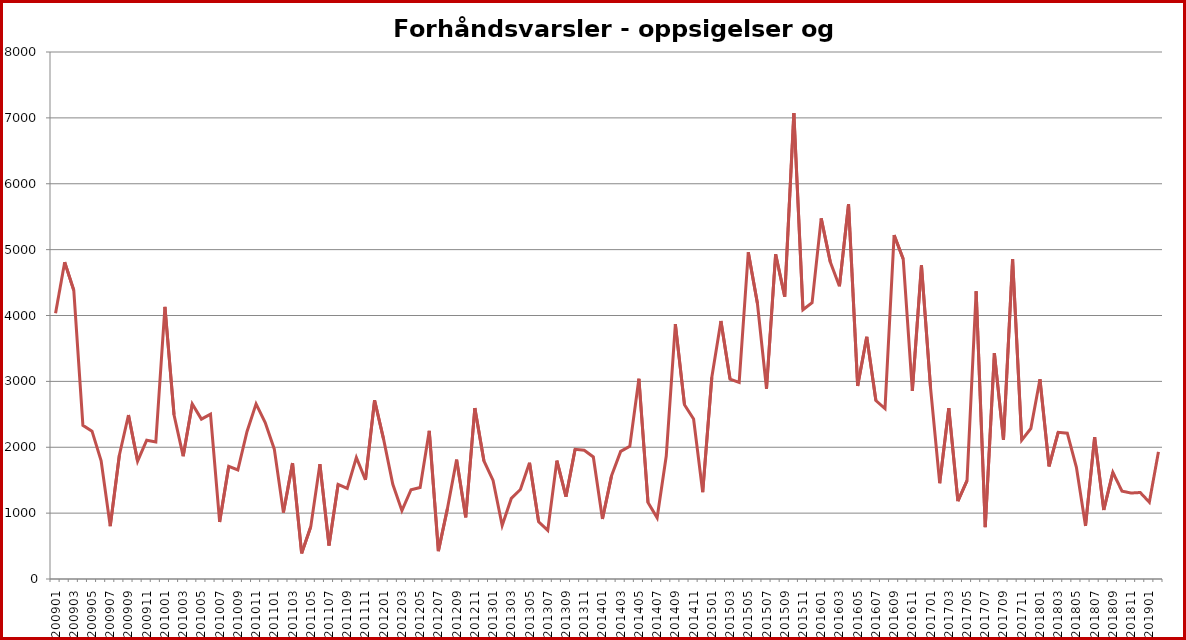
| Category | Series 1 |
|---|---|
| 200901.0 | 4035 |
| 200902.0 | 4810 |
| 200903.0 | 4381 |
| 200904.0 | 2332 |
| 200905.0 | 2245 |
| 200906.0 | 1794 |
| 200907.0 | 802 |
| 200908.0 | 1879 |
| 200909.0 | 2489 |
| 200910.0 | 1789 |
| 200911.0 | 2107 |
| 200912.0 | 2080 |
| 201001.0 | 4130 |
| 201002.0 | 2490 |
| 201003.0 | 1865 |
| 201004.0 | 2658 |
| 201005.0 | 2427 |
| 201006.0 | 2503 |
| 201007.0 | 866 |
| 201008.0 | 1711 |
| 201009.0 | 1655 |
| 201010.0 | 2235 |
| 201011.0 | 2658 |
| 201012.0 | 2374 |
| 201101.0 | 1971 |
| 201102.0 | 1008 |
| 201103.0 | 1759 |
| 201104.0 | 389 |
| 201105.0 | 794 |
| 201106.0 | 1744 |
| 201107.0 | 509 |
| 201108.0 | 1436 |
| 201109.0 | 1374 |
| 201110.0 | 1844 |
| 201111.0 | 1504 |
| 201112.0 | 2714 |
| 201201.0 | 2115 |
| 201202.0 | 1437 |
| 201203.0 | 1037 |
| 201204.0 | 1355 |
| 201205.0 | 1390 |
| 201206.0 | 2249 |
| 201207.0 | 423 |
| 201208.0 | 1073 |
| 201209.0 | 1812 |
| 201210.0 | 937 |
| 201211.0 | 2594 |
| 201212.0 | 1792 |
| 201301.0 | 1496 |
| 201302.0 | 813 |
| 201303.0 | 1223 |
| 201304.0 | 1358 |
| 201305.0 | 1765 |
| 201306.0 | 869 |
| 201307.0 | 738 |
| 201308.0 | 1797 |
| 201309.0 | 1250 |
| 201310.0 | 1969 |
| 201311.0 | 1954 |
| 201312.0 | 1853 |
| 201401.0 | 910 |
| 201402.0 | 1568 |
| 201403.0 | 1937 |
| 201404.0 | 2014 |
| 201405.0 | 3040 |
| 201406.0 | 1160 |
| 201407.0 | 929 |
| 201408.0 | 1866 |
| 201409.0 | 3868 |
| 201410.0 | 2646 |
| 201411.0 | 2429 |
| 201412.0 | 1317 |
| 201501.0 | 3062 |
| 201502.0 | 3915 |
| 201503.0 | 3035 |
| 201504.0 | 2985 |
| 201505.0 | 4960 |
| 201506.0 | 4185 |
| 201507.0 | 2888 |
| 201508.0 | 4930 |
| 201509.0 | 4286 |
| 201510.0 | 7072 |
| 201511.0 | 4087 |
| 201512.0 | 4193 |
| 201601.0 | 5475 |
| 201602.0 | 4812 |
| 201603.0 | 4444 |
| 201604.0 | 5691 |
| 201605.0 | 2931 |
| 201606.0 | 3676 |
| 201607.0 | 2709 |
| 201608.0 | 2588 |
| 201609.0 | 5220 |
| 201610.0 | 4857 |
| 201611.0 | 2855 |
| 201612.0 | 4761 |
| 201701.0 | 2898 |
| 201702.0 | 1454 |
| 201703.0 | 2594 |
| 201704.0 | 1182 |
| 201705.0 | 1494 |
| 201706.0 | 4368 |
| 201707.0 | 787 |
| 201708.0 | 3429 |
| 201709.0 | 2112 |
| 201710.0 | 4854 |
| 201711.0 | 2109 |
| 201712.0 | 2284 |
| 201801.0 | 3032 |
| 201802.0 | 1711 |
| 201803.0 | 2227 |
| 201804.0 | 2213 |
| 201805.0 | 1696 |
| 201806.0 | 805 |
| 201807.0 | 2153 |
| 201808.0 | 1048 |
| 201809.0 | 1619 |
| 201810.0 | 1334 |
| 201811.0 | 1305 |
| 201812.0 | 1313 |
| 201901.0 | 1166 |
| 201902.0 | 1930 |